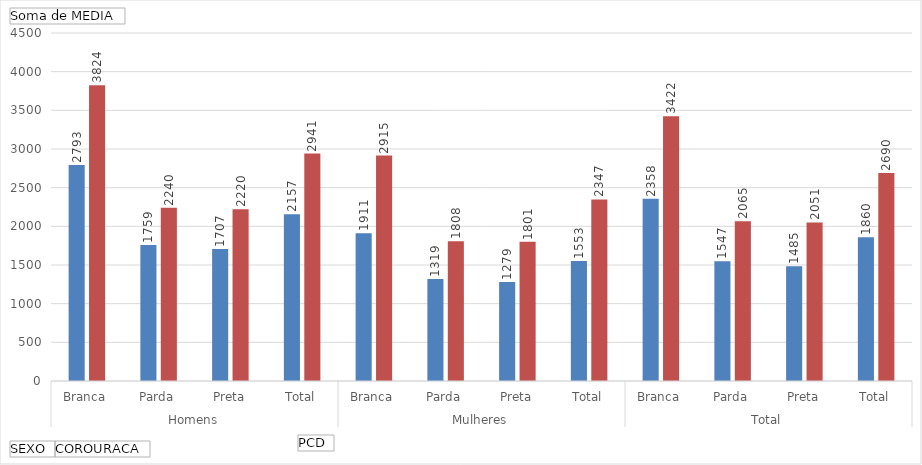
| Category | Pessoa com deficiência | Pessoa sem deficiência |
|---|---|---|
| 0 | 2793 | 3824 |
| 1 | 1759 | 2240 |
| 2 | 1707 | 2220 |
| 3 | 2157 | 2941 |
| 4 | 1911 | 2915 |
| 5 | 1319 | 1808 |
| 6 | 1279 | 1801 |
| 7 | 1553 | 2347 |
| 8 | 2358 | 3422 |
| 9 | 1547 | 2065 |
| 10 | 1485 | 2051 |
| 11 | 1860 | 2690 |